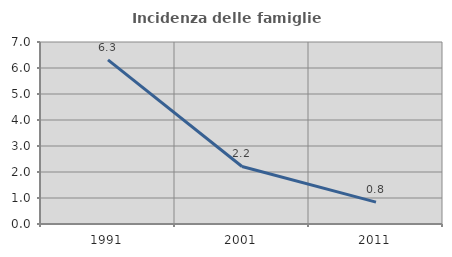
| Category | Incidenza delle famiglie numerose |
|---|---|
| 1991.0 | 6.311 |
| 2001.0 | 2.212 |
| 2011.0 | 0.841 |